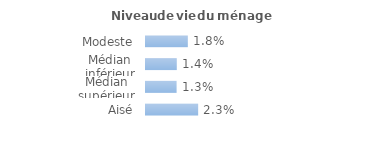
| Category | Series 0 |
|---|---|
| Modeste | 0.018 |
| Médian inférieur | 0.014 |
| Médian supérieur | 0.013 |
| Aisé | 0.023 |